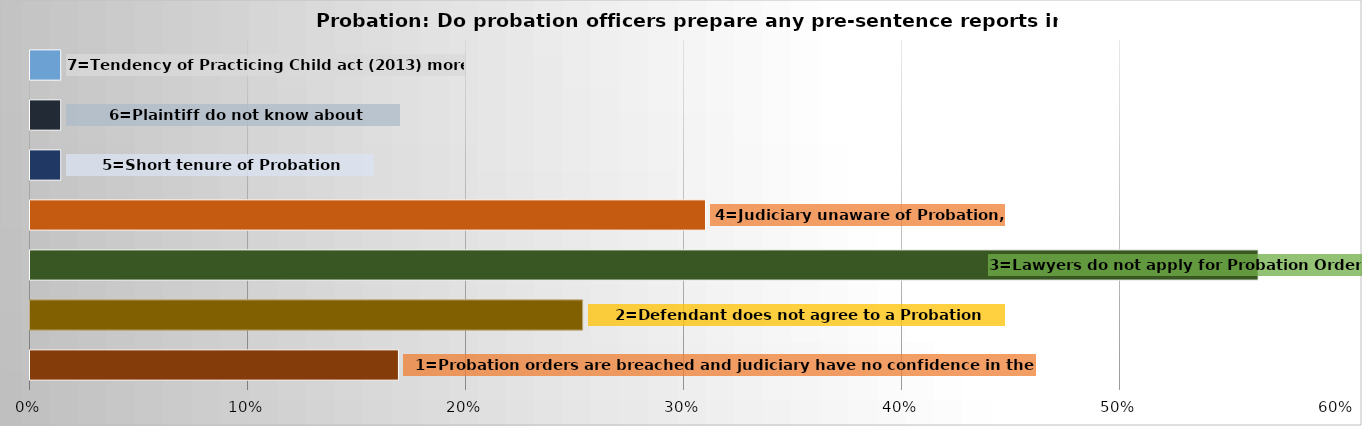
| Category | Series 0 |
|---|---|
| 1=Probation orders are breached and judiciary have no confidence in the order | 0.169 |
| 2=Defendant does not agree to a Probation Order | 0.254 |
| 3=Lawyers do not apply for Probation Order | 0.563 |
| 4=Judiciary unaware of Probation | 0.31 |
| 5=Short tenure of Probation Officers | 0.014 |
| 6=Plaintiff do not know about probation | 0.014 |
| 7=Tendency of Practicing Child act (2013) more  | 0.014 |